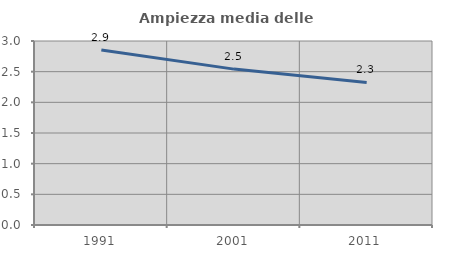
| Category | Ampiezza media delle famiglie |
|---|---|
| 1991.0 | 2.854 |
| 2001.0 | 2.542 |
| 2011.0 | 2.324 |